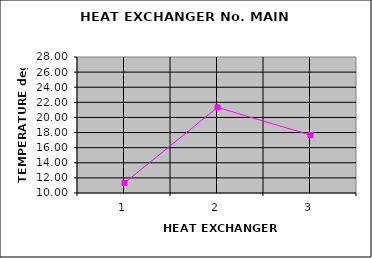
| Category | Series 1 |
|---|---|
| 0 | 11.33 |
| 1 | 21.33 |
| 2 | 17.67 |